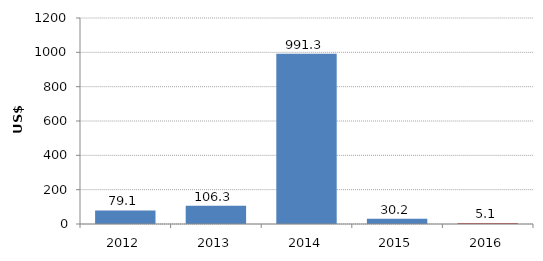
| Category | Committed (US$ million) |
|---|---|
| 2012.0 | 79.058 |
| 2013.0 | 106.316 |
| 2014.0 | 991.335 |
| 2015.0 | 30.156 |
| 2016.0 | 5.142 |